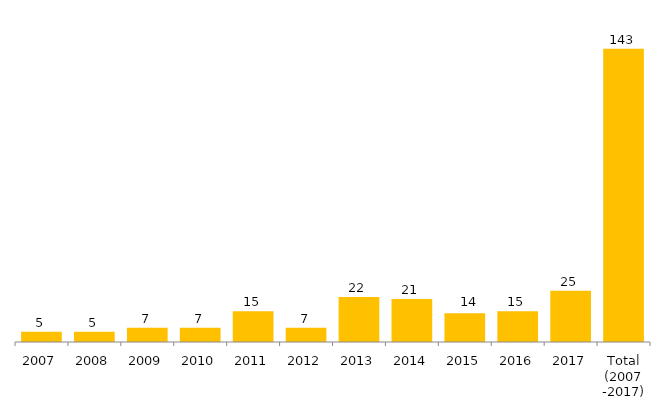
| Category | Total Geral |
|---|---|
| 2007 | 5 |
| 2008 | 5 |
| 2009 | 7 |
| 2010 | 7 |
| 2011 | 15 |
| 2012 | 7 |
| 2013 | 22 |
| 2014 | 21 |
| 2015 | 14 |
| 2016 | 15 |
| 2017 | 25 |
| Total (2007 -2017) | 143 |